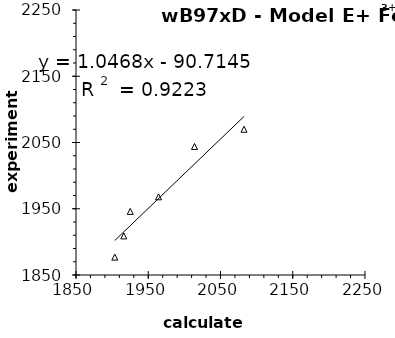
| Category | wB97xD |
|---|---|
| 1903.716397849462 | 1877 |
| 1916.173387096774 | 1909 |
| 1925.07123655914 | 1946 |
| 1964.221774193548 | 1968 |
| 2014.049731182796 | 2044 |
| 2082.563172043011 | 2070 |